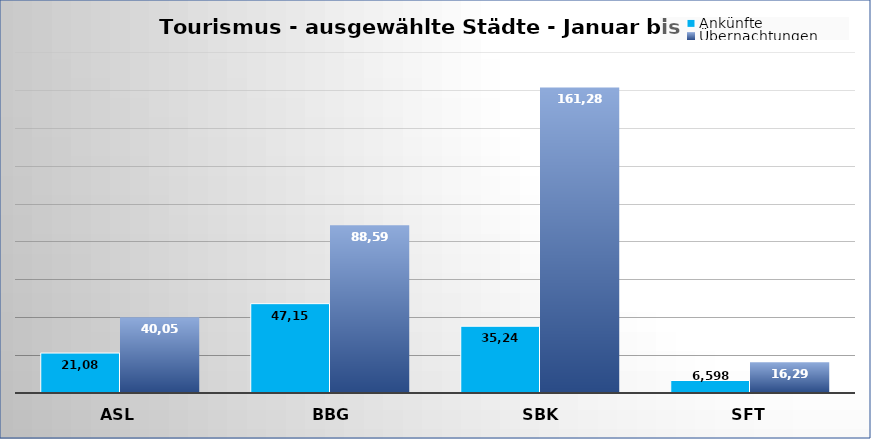
| Category | Ankünfte | Übernachtungen |
|---|---|---|
| ASL | 21083 | 40050 |
| BBG | 47154 | 88592 |
| SBK | 35242 | 161283 |
| SFT | 6598 | 16292 |